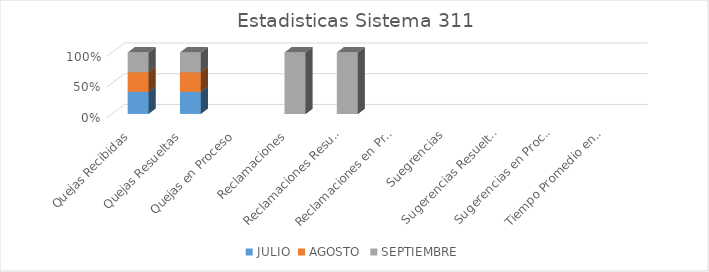
| Category | JULIO | AGOSTO | SEPTIEMBRE |
|---|---|---|---|
| Quejas Recibidas | 9 | 8 | 8 |
| Quejas Resueltas | 9 | 8 | 8 |
| Quejas en Proceso | 0 | 0 | 0 |
| Reclamaciones | 0 | 0 | 3 |
| Reclamaciones Resueltas | 0 | 0 | 3 |
| Reclamaciones en Proceso | 0 | 0 | 0 |
| Suegrencias | 0 | 0 | 0 |
| Sugerencias Resueltas | 0 | 0 | 0 |
| Sugerencias en Proceso | 0 | 0 | 0 |
| Tiempo Promedio en que fueron Respondidas | 0 | 0 | 0 |